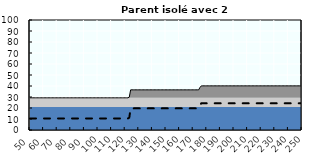
| Category | Coin fiscal marginal (somme des composantes) | Taux d’imposition marginal net |
|---|---|---|
| 50.0 | 29.249 | 10.5 |
| 51.0 | 29.249 | 10.5 |
| 52.0 | 29.249 | 10.5 |
| 53.0 | 29.249 | 10.5 |
| 54.0 | 29.249 | 10.5 |
| 55.0 | 29.249 | 10.5 |
| 56.0 | 29.249 | 10.5 |
| 57.0 | 29.249 | 10.5 |
| 58.0 | 29.249 | 10.5 |
| 59.0 | 29.249 | 10.5 |
| 60.0 | 29.249 | 10.5 |
| 61.0 | 29.249 | 10.5 |
| 62.0 | 29.249 | 10.5 |
| 63.0 | 29.249 | 10.5 |
| 64.0 | 29.249 | 10.5 |
| 65.0 | 29.249 | 10.5 |
| 66.0 | 29.249 | 10.5 |
| 67.0 | 29.249 | 10.5 |
| 68.0 | 29.249 | 10.5 |
| 69.0 | 29.249 | 10.5 |
| 70.0 | 29.249 | 10.5 |
| 71.0 | 29.249 | 10.5 |
| 72.0 | 29.249 | 10.5 |
| 73.0 | 29.249 | 10.5 |
| 74.0 | 29.249 | 10.5 |
| 75.0 | 29.249 | 10.5 |
| 76.0 | 29.249 | 10.5 |
| 77.0 | 29.249 | 10.5 |
| 78.0 | 29.249 | 10.5 |
| 79.0 | 29.249 | 10.5 |
| 80.0 | 29.249 | 10.5 |
| 81.0 | 29.249 | 10.5 |
| 82.0 | 29.249 | 10.5 |
| 83.0 | 29.249 | 10.5 |
| 84.0 | 29.249 | 10.5 |
| 85.0 | 29.249 | 10.5 |
| 86.0 | 29.249 | 10.5 |
| 87.0 | 29.249 | 10.5 |
| 88.0 | 29.249 | 10.5 |
| 89.0 | 29.249 | 10.5 |
| 90.0 | 29.249 | 10.5 |
| 91.0 | 29.249 | 10.5 |
| 92.0 | 29.249 | 10.5 |
| 93.0 | 29.249 | 10.5 |
| 94.0 | 29.249 | 10.5 |
| 95.0 | 29.249 | 10.5 |
| 96.0 | 29.249 | 10.5 |
| 97.0 | 29.249 | 10.5 |
| 98.0 | 29.249 | 10.5 |
| 99.0 | 29.249 | 10.5 |
| 100.0 | 29.249 | 10.5 |
| 101.0 | 29.249 | 10.5 |
| 102.0 | 29.249 | 10.5 |
| 103.0 | 29.249 | 10.5 |
| 104.0 | 29.249 | 10.5 |
| 105.0 | 29.249 | 10.5 |
| 106.0 | 29.249 | 10.5 |
| 107.0 | 29.249 | 10.5 |
| 108.0 | 29.249 | 10.5 |
| 109.0 | 29.249 | 10.5 |
| 110.0 | 29.249 | 10.5 |
| 111.0 | 29.249 | 10.5 |
| 112.0 | 29.249 | 10.5 |
| 113.0 | 29.249 | 10.5 |
| 114.0 | 29.249 | 10.5 |
| 115.0 | 29.249 | 10.5 |
| 116.0 | 29.249 | 10.5 |
| 117.0 | 29.249 | 10.5 |
| 118.0 | 29.249 | 10.5 |
| 119.0 | 29.249 | 10.5 |
| 120.0 | 29.249 | 10.5 |
| 121.0 | 29.249 | 10.5 |
| 122.0 | 29.249 | 10.5 |
| 123.0 | 29.831 | 11.237 |
| 124.0 | 36.504 | 19.678 |
| 125.0 | 36.504 | 19.678 |
| 126.0 | 36.504 | 19.678 |
| 127.0 | 36.504 | 19.678 |
| 128.0 | 36.504 | 19.678 |
| 129.0 | 36.504 | 19.678 |
| 130.0 | 36.504 | 19.678 |
| 131.0 | 36.504 | 19.678 |
| 132.0 | 36.504 | 19.678 |
| 133.0 | 36.504 | 19.678 |
| 134.0 | 36.504 | 19.678 |
| 135.0 | 36.504 | 19.678 |
| 136.0 | 36.504 | 19.678 |
| 137.0 | 36.504 | 19.678 |
| 138.0 | 36.504 | 19.678 |
| 139.0 | 36.504 | 19.678 |
| 140.0 | 36.504 | 19.678 |
| 141.0 | 36.504 | 19.678 |
| 142.0 | 36.504 | 19.678 |
| 143.0 | 36.504 | 19.678 |
| 144.0 | 36.504 | 19.678 |
| 145.0 | 36.504 | 19.678 |
| 146.0 | 36.504 | 19.678 |
| 147.0 | 36.504 | 19.678 |
| 148.0 | 36.504 | 19.678 |
| 149.0 | 36.504 | 19.678 |
| 150.0 | 36.504 | 19.678 |
| 151.0 | 36.504 | 19.678 |
| 152.0 | 36.504 | 19.678 |
| 153.0 | 36.504 | 19.678 |
| 154.0 | 36.504 | 19.678 |
| 155.0 | 36.504 | 19.678 |
| 156.0 | 36.504 | 19.678 |
| 157.0 | 36.504 | 19.678 |
| 158.0 | 36.504 | 19.678 |
| 159.0 | 36.504 | 19.678 |
| 160.0 | 36.504 | 19.678 |
| 161.0 | 36.504 | 19.678 |
| 162.0 | 36.504 | 19.678 |
| 163.0 | 36.504 | 19.678 |
| 164.0 | 36.504 | 19.678 |
| 165.0 | 36.504 | 19.678 |
| 166.0 | 36.504 | 19.678 |
| 167.0 | 36.504 | 19.678 |
| 168.0 | 36.504 | 19.678 |
| 169.0 | 36.504 | 19.678 |
| 170.0 | 36.504 | 19.678 |
| 171.0 | 36.504 | 19.678 |
| 172.0 | 36.504 | 19.678 |
| 173.0 | 36.504 | 19.678 |
| 174.0 | 36.504 | 19.678 |
| 175.0 | 38.729 | 22.492 |
| 176.0 | 40.132 | 24.267 |
| 177.0 | 40.132 | 24.267 |
| 178.0 | 40.132 | 24.267 |
| 179.0 | 40.132 | 24.267 |
| 180.0 | 40.132 | 24.267 |
| 181.0 | 40.132 | 24.267 |
| 182.0 | 40.132 | 24.267 |
| 183.0 | 40.132 | 24.267 |
| 184.0 | 40.132 | 24.267 |
| 185.0 | 40.132 | 24.267 |
| 186.0 | 40.132 | 24.267 |
| 187.0 | 40.132 | 24.267 |
| 188.0 | 40.132 | 24.267 |
| 189.0 | 40.132 | 24.267 |
| 190.0 | 40.132 | 24.267 |
| 191.0 | 40.132 | 24.267 |
| 192.0 | 40.132 | 24.267 |
| 193.0 | 40.132 | 24.267 |
| 194.0 | 40.132 | 24.267 |
| 195.0 | 40.132 | 24.267 |
| 196.0 | 40.132 | 24.267 |
| 197.0 | 40.132 | 24.267 |
| 198.0 | 40.132 | 24.267 |
| 199.0 | 40.132 | 24.267 |
| 200.0 | 40.132 | 24.267 |
| 201.0 | 40.132 | 24.267 |
| 202.0 | 40.132 | 24.267 |
| 203.0 | 40.132 | 24.267 |
| 204.0 | 40.132 | 24.267 |
| 205.0 | 40.132 | 24.267 |
| 206.0 | 40.132 | 24.267 |
| 207.0 | 40.132 | 24.267 |
| 208.0 | 40.132 | 24.267 |
| 209.0 | 40.132 | 24.267 |
| 210.0 | 40.132 | 24.267 |
| 211.0 | 40.132 | 24.267 |
| 212.0 | 40.132 | 24.267 |
| 213.0 | 40.132 | 24.267 |
| 214.0 | 40.132 | 24.267 |
| 215.0 | 40.132 | 24.267 |
| 216.0 | 40.132 | 24.267 |
| 217.0 | 40.132 | 24.267 |
| 218.0 | 40.132 | 24.267 |
| 219.0 | 40.132 | 24.267 |
| 220.0 | 40.132 | 24.267 |
| 221.0 | 40.132 | 24.267 |
| 222.0 | 40.132 | 24.267 |
| 223.0 | 40.132 | 24.267 |
| 224.0 | 40.132 | 24.267 |
| 225.0 | 40.132 | 24.267 |
| 226.0 | 40.132 | 24.267 |
| 227.0 | 40.132 | 24.267 |
| 228.0 | 40.132 | 24.267 |
| 229.0 | 40.132 | 24.267 |
| 230.0 | 40.132 | 24.267 |
| 231.0 | 40.132 | 24.267 |
| 232.0 | 40.132 | 24.267 |
| 233.0 | 40.132 | 24.267 |
| 234.0 | 40.132 | 24.267 |
| 235.0 | 40.132 | 24.267 |
| 236.0 | 40.132 | 24.267 |
| 237.0 | 40.132 | 24.267 |
| 238.0 | 40.132 | 24.267 |
| 239.0 | 40.132 | 24.267 |
| 240.0 | 40.132 | 24.267 |
| 241.0 | 40.132 | 24.267 |
| 242.0 | 40.132 | 24.267 |
| 243.0 | 40.132 | 24.267 |
| 244.0 | 40.132 | 24.267 |
| 245.0 | 40.132 | 24.267 |
| 246.0 | 40.132 | 24.267 |
| 247.0 | 40.132 | 24.267 |
| 248.0 | 40.132 | 24.267 |
| 249.0 | 40.132 | 24.267 |
| 250.0 | 40.132 | 24.267 |